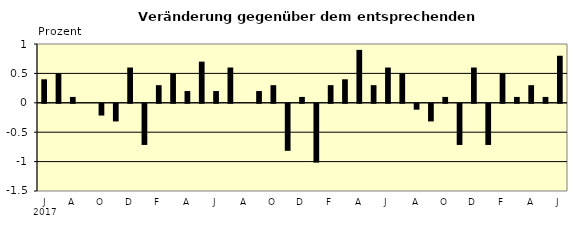
| Category | Series 0 |
|---|---|
| 0 | 0.4 |
| 1 | 0.5 |
| 2 | 0.1 |
| 3 | 0 |
| 4 | -0.2 |
| 5 | -0.3 |
| 6 | 0.6 |
| 7 | -0.7 |
| 8 | 0.3 |
| 9 | 0.5 |
| 10 | 0.2 |
| 11 | 0.7 |
| 12 | 0.2 |
| 13 | 0.6 |
| 14 | 0 |
| 15 | 0.2 |
| 16 | 0.3 |
| 17 | -0.8 |
| 18 | 0.1 |
| 19 | -1 |
| 20 | 0.3 |
| 21 | 0.4 |
| 22 | 0.9 |
| 23 | 0.3 |
| 24 | 0.6 |
| 25 | 0.5 |
| 26 | -0.1 |
| 27 | -0.3 |
| 28 | 0.1 |
| 29 | -0.7 |
| 30 | 0.6 |
| 31 | -0.7 |
| 32 | 0.5 |
| 33 | 0.1 |
| 34 | 0.3 |
| 35 | 0.1 |
| 36 | 0.8 |